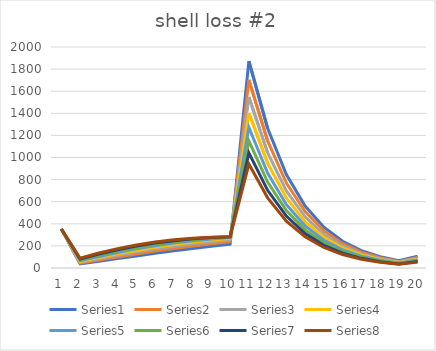
| Category | Series 0 | Series 1 | Series 2 | Series 3 | Series 4 | Series 5 | Series 6 | Series 7 |
|---|---|---|---|---|---|---|---|---|
| 0 | 353.2 | 353.2 | 353.2 | 353.2 | 353.2 | 353.2 | 353.2 | 353.2 |
| 1 | 36.936 | 44.323 | 51.71 | 59.098 | 66.485 | 73.872 | 81.259 | 88.647 |
| 2 | 60.759 | 72.143 | 83.272 | 94.144 | 104.761 | 115.122 | 125.227 | 135.077 |
| 3 | 85.213 | 100.115 | 114.328 | 127.866 | 140.739 | 152.959 | 164.537 | 175.484 |
| 4 | 109.51 | 127.305 | 143.833 | 159.135 | 173.252 | 186.225 | 198.095 | 208.901 |
| 5 | 133.165 | 153.175 | 171.221 | 187.399 | 201.806 | 214.534 | 225.673 | 235.309 |
| 6 | 155.87 | 177.405 | 196.195 | 212.425 | 226.269 | 237.897 | 247.468 | 255.135 |
| 7 | 177.424 | 199.81 | 218.623 | 234.162 | 246.712 | 256.54 | 263.896 | 269.015 |
| 8 | 197.696 | 220.297 | 238.474 | 252.678 | 263.327 | 270.807 | 275.477 | 277.666 |
| 9 | 216.611 | 238.833 | 255.789 | 268.11 | 276.372 | 281.1 | 282.77 | 281.815 |
| 10 | 1873.014 | 1702.861 | 1546.59 | 1403.198 | 1271.748 | 1151.36 | 1041.211 | 940.53 |
| 11 | 1264.329 | 1149.471 | 1043.984 | 947.192 | 858.46 | 777.195 | 702.842 | 634.88 |
| 12 | 845.436 | 768.633 | 698.096 | 633.372 | 574.038 | 519.698 | 469.979 | 424.534 |
| 13 | 560.805 | 509.859 | 463.069 | 420.136 | 380.778 | 344.732 | 311.752 | 281.607 |
| 14 | 369.432 | 335.871 | 305.048 | 276.766 | 250.839 | 227.094 | 205.368 | 185.51 |
| 15 | 241.901 | 219.926 | 199.743 | 181.224 | 164.247 | 148.699 | 134.473 | 121.47 |
| 16 | 157.558 | 143.245 | 130.099 | 118.037 | 106.979 | 96.852 | 87.587 | 79.117 |
| 17 | 102.142 | 92.863 | 84.341 | 76.521 | 69.353 | 62.788 | 56.781 | 51.29 |
| 18 | 65.94 | 59.95 | 54.448 | 49.4 | 44.772 | 40.534 | 36.656 | 33.112 |
| 19 | 106.024 | 96.392 | 87.546 | 79.43 | 71.989 | 65.174 | 58.939 | 53.24 |